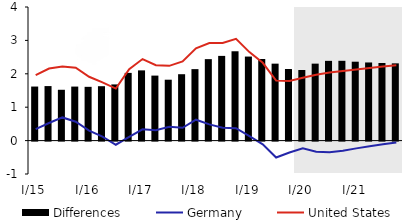
| Category | Differences |
|---|---|
| 0 | 1.618 |
| 1 | 1.632 |
| 2 | 1.522 |
| 3 | 1.617 |
| 4 | 1.61 |
| 5 | 1.629 |
| 6 | 1.682 |
| 7 | 2.027 |
| 8 | 2.102 |
| 9 | 1.946 |
| 10 | 1.823 |
| 11 | 1.988 |
| 12 | 2.14 |
| 13 | 2.439 |
| 14 | 2.536 |
| 15 | 2.675 |
| 16 | 2.516 |
| 17 | 2.442 |
| 18 | 2.304 |
| 19 | 2.143 |
| 20 | 2.113 |
| 21 | 2.304 |
| 22 | 2.388 |
| 23 | 2.389 |
| 24 | 2.362 |
| 25 | 2.339 |
| 26 | 2.323 |
| 27 | 2.313 |